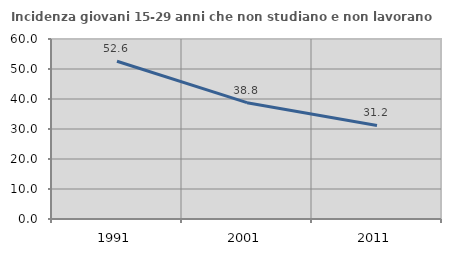
| Category | Incidenza giovani 15-29 anni che non studiano e non lavorano  |
|---|---|
| 1991.0 | 52.599 |
| 2001.0 | 38.776 |
| 2011.0 | 31.18 |